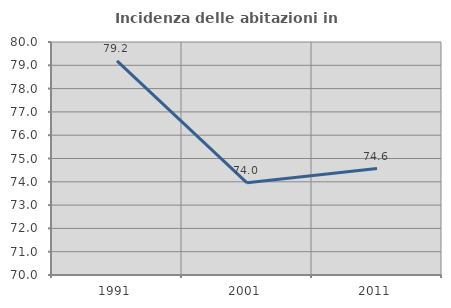
| Category | Incidenza delle abitazioni in proprietà  |
|---|---|
| 1991.0 | 79.192 |
| 2001.0 | 73.956 |
| 2011.0 | 74.571 |